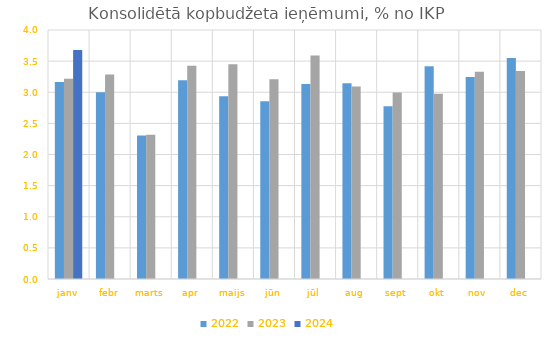
| Category | 2022 | 2023 | 2024 |
|---|---|---|---|
| janv | 3.165 | 3.216 | 3.679 |
| febr | 3.001 | 3.284 | 0 |
| marts | 2.306 | 2.317 | 0 |
| apr | 3.191 | 3.426 | 0 |
| maijs | 2.937 | 3.45 | 0 |
| jūn | 2.856 | 3.208 | 0 |
| jūl | 3.132 | 3.591 | 0 |
| aug | 3.144 | 3.094 | 0 |
| sept | 2.776 | 2.996 | 0 |
| okt | 3.418 | 2.976 | 0 |
| nov | 3.247 | 3.331 | 0 |
| dec | 3.549 | 3.341 | 0 |